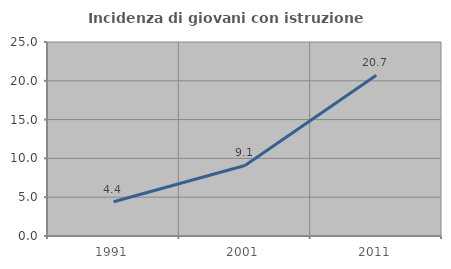
| Category | Incidenza di giovani con istruzione universitaria |
|---|---|
| 1991.0 | 4.412 |
| 2001.0 | 9.091 |
| 2011.0 | 20.721 |